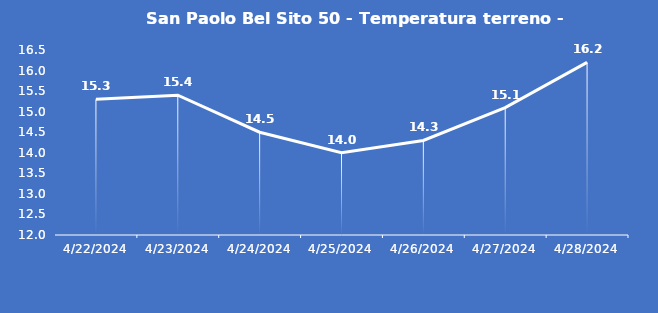
| Category | San Paolo Bel Sito 50 - Temperatura terreno - Grezzo (°C) |
|---|---|
| 4/22/24 | 15.3 |
| 4/23/24 | 15.4 |
| 4/24/24 | 14.5 |
| 4/25/24 | 14 |
| 4/26/24 | 14.3 |
| 4/27/24 | 15.1 |
| 4/28/24 | 16.2 |